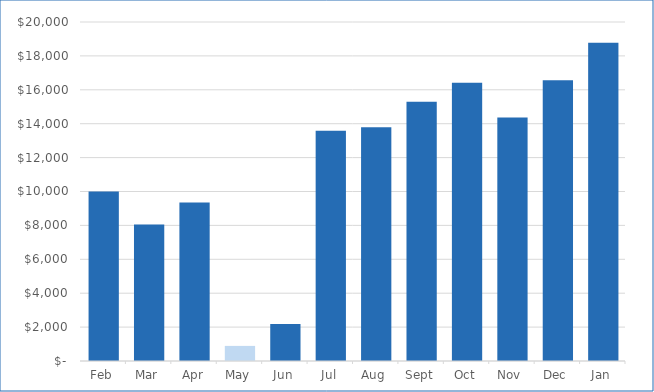
| Category |  Not Below Minimum  |  Below Minimum  |
|---|---|---|
| 2023-02-01 | 10000 | 0 |
| 2023-03-01 | 8050 | 0 |
| 2023-04-01 | 9350 | 0 |
| 2023-05-01 | 0 | 890 |
| 2023-06-01 | 2190 | 0 |
| 2023-07-01 | 13590 | 0 |
| 2023-08-01 | 13790 | 0 |
| 2023-09-01 | 15290 | 0 |
| 2023-10-01 | 16410 | 0 |
| 2023-11-01 | 14360 | 0 |
| 2023-12-01 | 16560 | 0 |
| 2024-01-01 | 18780 | 0 |